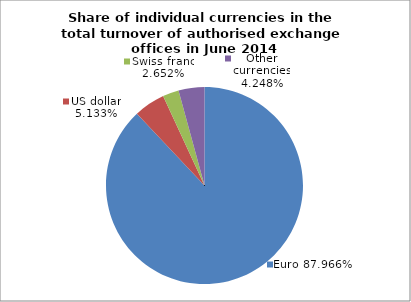
| Category | EUR |
|---|---|
| 0 | 0.88 |
| 1 | 0.051 |
| 2 | 0.027 |
| 3 | 0.042 |